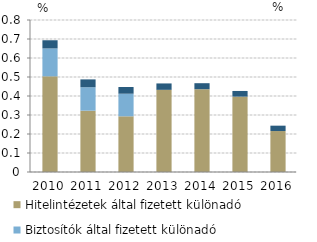
| Category | Hitelintézetek által fizetett különadó | Biztosítók által fizetett különadó | Egyéb pénzügyi vállalkozások által fizetett különadó |
|---|---|---|---|
| 2010-01-01 | 0.503 | 0.147 | 0.043 |
| 2011-01-01 | 0.323 | 0.124 | 0.041 |
| 2012-01-01 | 0.293 | 0.119 | 0.035 |
| 2013-01-01 | 0.432 | 0 | 0.034 |
| 2014-01-01 | 0.436 | 0 | 0.032 |
| 2015-01-01 | 0.397 | 0 | 0.03 |
| 2016-01-01 | 0.216 | 0 | 0.028 |